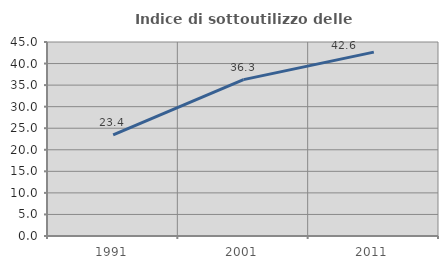
| Category | Indice di sottoutilizzo delle abitazioni  |
|---|---|
| 1991.0 | 23.433 |
| 2001.0 | 36.278 |
| 2011.0 | 42.647 |